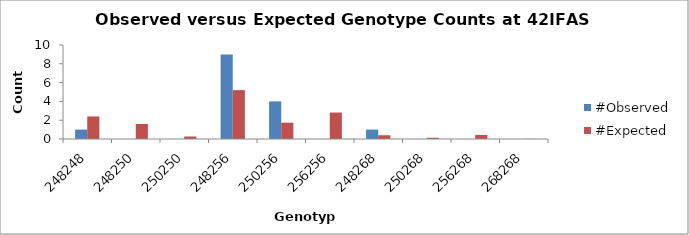
| Category | #Observed | #Expected |
|---|---|---|
| 248248.0 | 1 | 2.4 |
| 248250.0 | 0 | 1.6 |
| 250250.0 | 0 | 0.267 |
| 248256.0 | 9 | 5.2 |
| 250256.0 | 4 | 1.733 |
| 256256.0 | 0 | 2.817 |
| 248268.0 | 1 | 0.4 |
| 250268.0 | 0 | 0.133 |
| 256268.0 | 0 | 0.433 |
| 268268.0 | 0 | 0.017 |